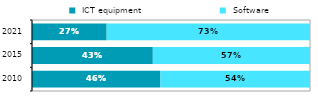
| Category |  ICT equipment |  Software |
|---|---|---|
| 2010.0 | 0.462 | 0.538 |
| 2015.0 | 0.435 | 0.565 |
| 2021.0 | 0.269 | 0.731 |